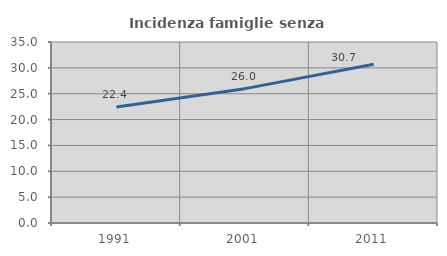
| Category | Incidenza famiglie senza nuclei |
|---|---|
| 1991.0 | 22.436 |
| 2001.0 | 25.979 |
| 2011.0 | 30.696 |